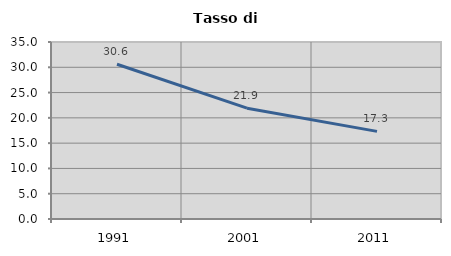
| Category | Tasso di disoccupazione   |
|---|---|
| 1991.0 | 30.593 |
| 2001.0 | 21.911 |
| 2011.0 | 17.328 |